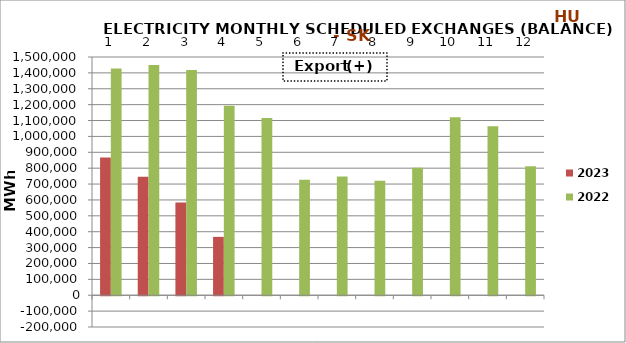
| Category | 2023 | 2022 |
|---|---|---|
| 0 | 867906.05 | 1427269.4 |
| 1 | 745628.775 | 1449616.4 |
| 2 | 584533.925 | 1418433.3 |
| 3 | 367608 | 1193446.2 |
| 4 | 0 | 1115427.9 |
| 5 | 0 | 726641.6 |
| 6 | 0 | 748162.1 |
| 7 | 0 | 721148.9 |
| 8 | 0 | 802188.7 |
| 9 | 0 | 1119913.9 |
| 10 | 0 | 1063413.375 |
| 11 | 0 | 812903.225 |